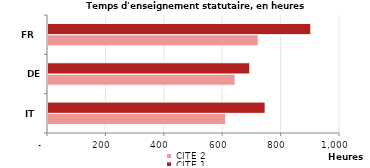
| Category | CITE 2 | CITE 1 |
|---|---|---|
| IT | 608.4 | 743.6 |
| DE | 640.659 | 691.162 |
| FR | 720 | 900 |